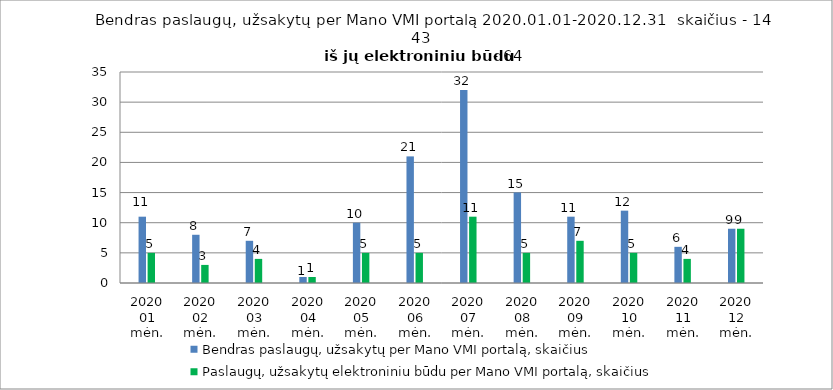
| Category | Bendras paslaugų, užsakytų per Mano VMI portalą, skaičius | Paslaugų, užsakytų elektroniniu būdu per Mano VMI portalą, skaičius |
|---|---|---|
| 2020 01 mėn. | 11 | 5 |
| 2020 02 mėn. | 8 | 3 |
| 2020 03 mėn. | 7 | 4 |
| 2020 04 mėn. | 1 | 1 |
| 2020 05 mėn. | 10 | 5 |
| 2020 06 mėn. | 21 | 5 |
| 2020 07 mėn. | 32 | 11 |
| 2020 08 mėn. | 15 | 5 |
| 2020 09 mėn. | 11 | 7 |
| 2020 10 mėn. | 12 | 5 |
| 2020 11 mėn. | 6 | 4 |
| 2020 12 mėn. | 9 | 9 |